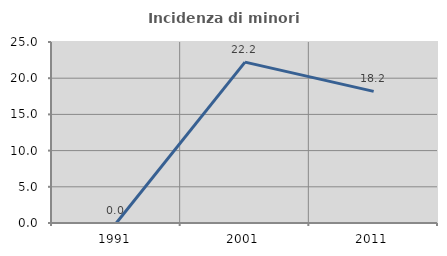
| Category | Incidenza di minori stranieri |
|---|---|
| 1991.0 | 0 |
| 2001.0 | 22.222 |
| 2011.0 | 18.182 |